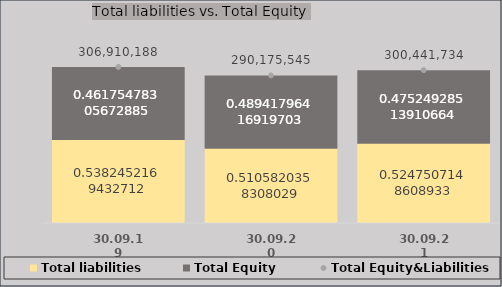
| Category | Total liabilities | Total Equity |
|---|---|---|
| 30.09.19 | 165192940.799 | 141717247.344 |
| 30.09.20 | 148158420.653 | 142017124.618 |
| 30.09.21 | 157657014.433 | 142784719.076 |